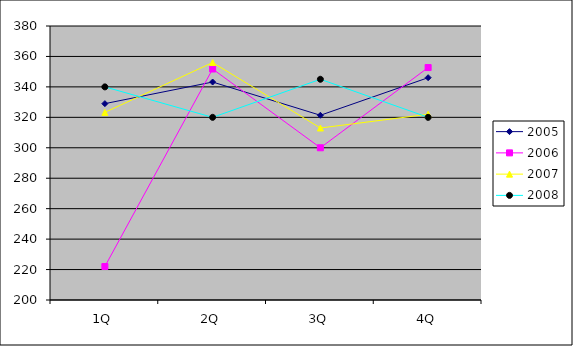
| Category | 2005 | 2006 | 2007 | 2008 |
|---|---|---|---|---|
| 1Q | 329 | 222 | 323.251 | 340 |
| 2Q | 343.2 | 351.75 | 356 | 320 |
| 3Q | 321.35 | 300 | 313 | 345 |
| 4Q | 346.05 | 352.7 | 322 | 320 |